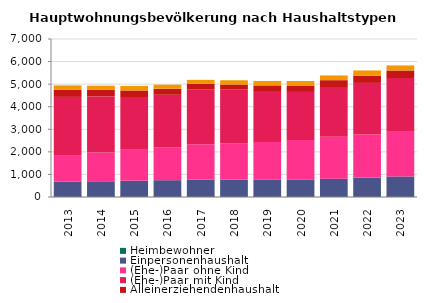
| Category | Heimbewohner | Einpersonenhaushalt | (Ehe-)Paar ohne Kind | (Ehe-)Paar mit Kind | Alleinerziehendenhaushalt | sonstiger Mehrpersonenhaushalt |
|---|---|---|---|---|---|---|
| 2013.0 | 53 | 623 | 1151 | 2609 | 323 | 185 |
| 2014.0 | 56 | 641 | 1274 | 2483 | 290 | 188 |
| 2015.0 | 56 | 668 | 1370 | 2336 | 290 | 200 |
| 2016.0 | 59 | 686 | 1454 | 2330 | 269 | 179 |
| 2017.0 | 53 | 710 | 1574 | 2435 | 239 | 179 |
| 2018.0 | 53 | 710 | 1616 | 2375 | 230 | 188 |
| 2019.0 | 50 | 728 | 1658 | 2255 | 254 | 197 |
| 2020.0 | 53 | 725 | 1742 | 2135 | 263 | 221 |
| 2021.0 | 53 | 761 | 1850 | 2207 | 305 | 209 |
| 2022.0 | 47 | 803 | 1919 | 2285 | 323 | 230 |
| 2023.0 | 50 | 860 | 2018 | 2339 | 338 | 224 |